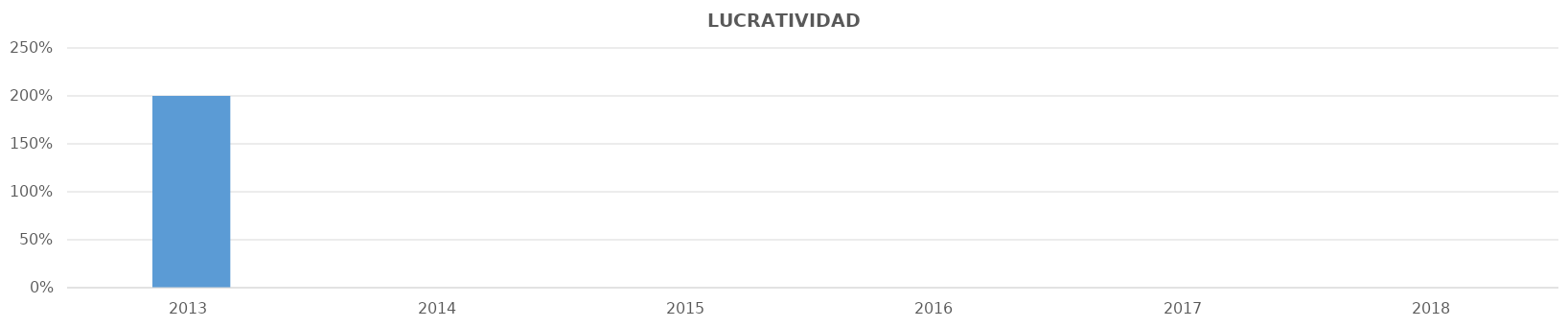
| Category | Series 0 |
|---|---|
| 2013.0 | 2 |
| 2014.0 | 0 |
| 2015.0 | 0 |
| 2016.0 | 0 |
| 2017.0 | 0 |
| 2018.0 | 0 |